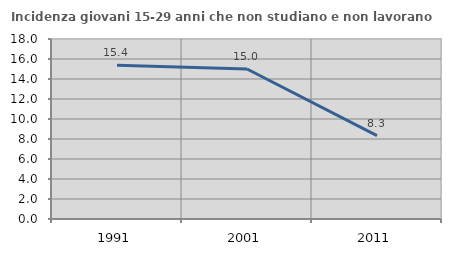
| Category | Incidenza giovani 15-29 anni che non studiano e non lavorano  |
|---|---|
| 1991.0 | 15.385 |
| 2001.0 | 15 |
| 2011.0 | 8.333 |